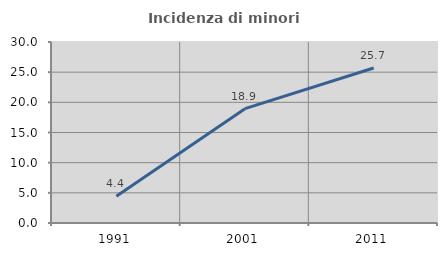
| Category | Incidenza di minori stranieri |
|---|---|
| 1991.0 | 4.444 |
| 2001.0 | 18.947 |
| 2011.0 | 25.691 |